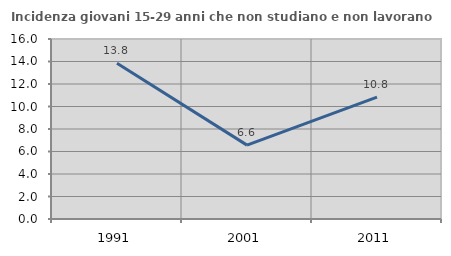
| Category | Incidenza giovani 15-29 anni che non studiano e non lavorano  |
|---|---|
| 1991.0 | 13.839 |
| 2001.0 | 6.566 |
| 2011.0 | 10.839 |